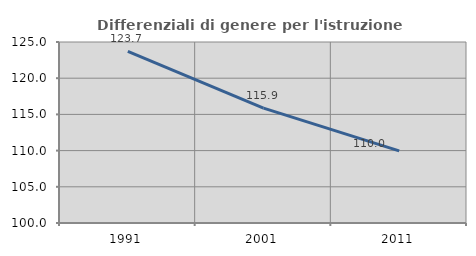
| Category | Differenziali di genere per l'istruzione superiore |
|---|---|
| 1991.0 | 123.701 |
| 2001.0 | 115.868 |
| 2011.0 | 109.958 |